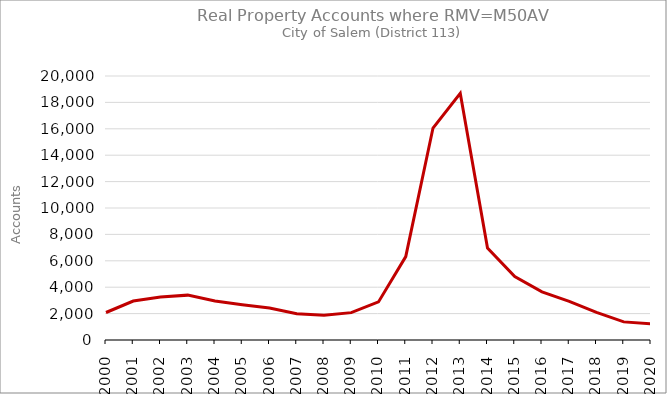
| Category | Series 0 |
|---|---|
| 2000.0 | 2083 |
| 2001.0 | 2952 |
| 2002.0 | 3254 |
| 2003.0 | 3399 |
| 2004.0 | 2951 |
| 2005.0 | 2666 |
| 2006.0 | 2425 |
| 2007.0 | 1985 |
| 2008.0 | 1877 |
| 2009.0 | 2073 |
| 2010.0 | 2886 |
| 2011.0 | 6320 |
| 2012.0 | 16056 |
| 2013.0 | 18695 |
| 2014.0 | 6972 |
| 2015.0 | 4802 |
| 2016.0 | 3642 |
| 2017.0 | 2933 |
| 2018.0 | 2091 |
| 2019.0 | 1373 |
| 2020.0 | 1221 |